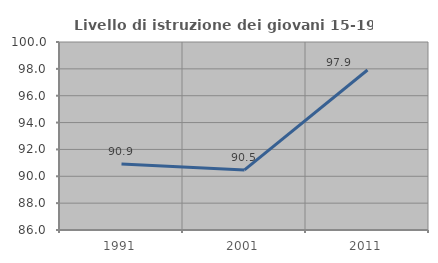
| Category | Livello di istruzione dei giovani 15-19 anni |
|---|---|
| 1991.0 | 90.909 |
| 2001.0 | 90.476 |
| 2011.0 | 97.917 |